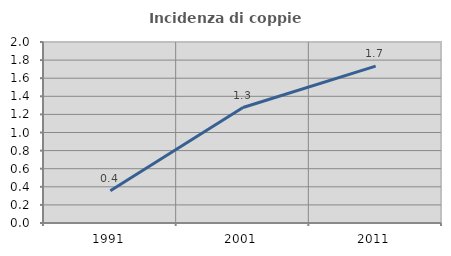
| Category | Incidenza di coppie miste |
|---|---|
| 1991.0 | 0.356 |
| 2001.0 | 1.276 |
| 2011.0 | 1.733 |